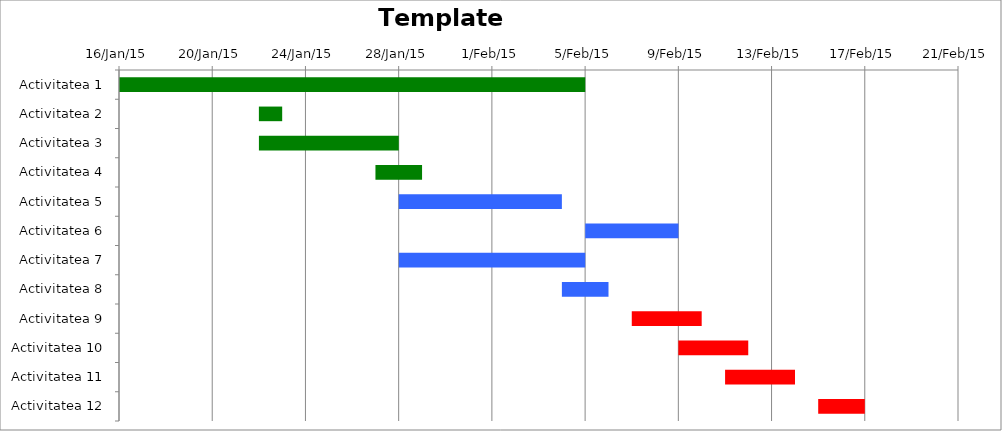
| Category | Start | Durata (zile) |
|---|---|---|
| Activitatea 1 | 16-Jan-15 | 20 |
| Activitatea 2 | 22-Jan-15 | 1 |
| Activitatea 3 | 22-Jan-15 | 6 |
| Activitatea 4 | 27-Jan-15 | 2 |
| Activitatea 5 | 28-Jan-15 | 7 |
| Activitatea 6 | 5-Feb-15 | 4 |
| Activitatea 7 | 28-Jan-15 | 8 |
| Activitatea 8 | 4-Feb-15 | 2 |
| Activitatea 9 | 7-Feb-15 | 3 |
| Activitatea 10 | 9-Feb-15 | 3 |
| Activitatea 11 | 11-Feb-15 | 3 |
| Activitatea 12 | 15-Feb-15 | 2 |